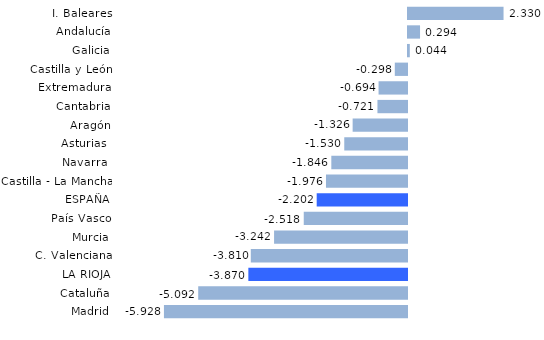
| Category | Series 0 |
|---|---|
| Madrid | -5.928 |
| Cataluña | -5.092 |
| LA RIOJA | -3.87 |
| C. Valenciana | -3.81 |
| Murcia | -3.242 |
| País Vasco | -2.518 |
| ESPAÑA | -2.202 |
| Castilla - La Mancha | -1.976 |
| Navarra  | -1.846 |
| Asturias  | -1.53 |
| Aragón | -1.326 |
| Cantabria | -0.721 |
| Extremadura | -0.694 |
| Castilla y León | -0.298 |
| Galicia | 0.044 |
| Andalucía | 0.294 |
| I. Baleares | 2.33 |